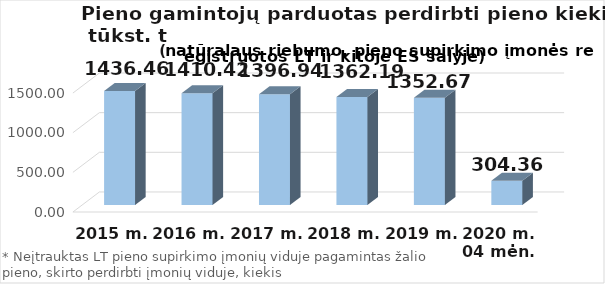
| Category | Viso |
|---|---|
| 2015 m. | 1436.455 |
| 2016 m. | 1410.42 |
| 2017 m.  | 1396.944 |
| 2018 m.  | 1362.189 |
| 2019 m.  | 1352.67 |
| 2020 m. 04 mėn. | 304.36 |